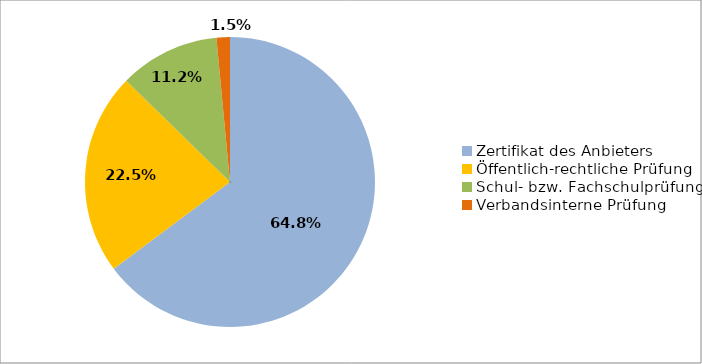
| Category | Series 0 |
|---|---|
| Zertifikat des Anbieters | 0.648 |
| Öffentlich-rechtliche Prüfung | 0.225 |
| Schul- bzw. Fachschulprüfung | 0.112 |
| Verbandsinterne Prüfung | 0.015 |